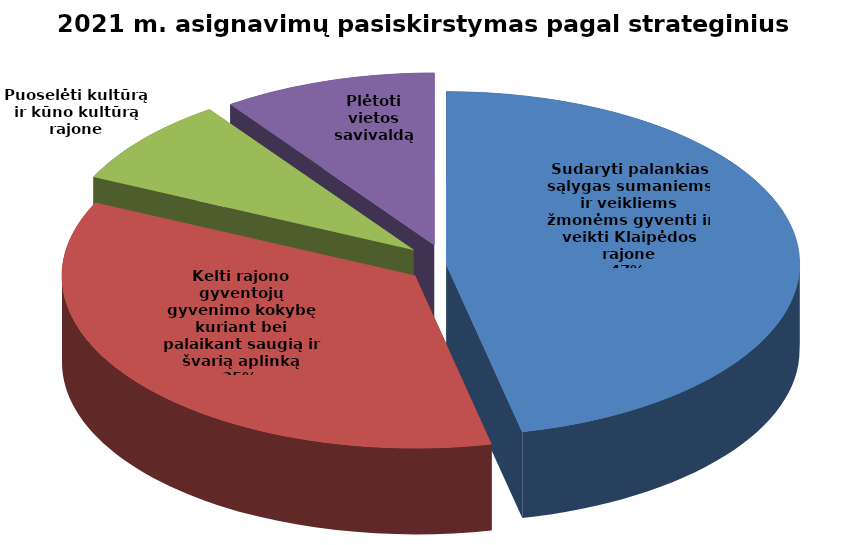
| Category | Series 0 |
|---|---|
| Sudaryti palankias sąlygas sumaniems ir veikliems žmonėms gyventi ir veikti Klaipėdos rajone | 48208.7 |
| Kelti rajono gyventojų gyvenimo kokybę kuriant bei palaikant saugią ir švarią aplinką | 36699.7 |
| Puoselėti kultūrą ir kūno kultūrą rajone | 8528.5 |
| Plėtoti vietos savivaldą | 10141.8 |